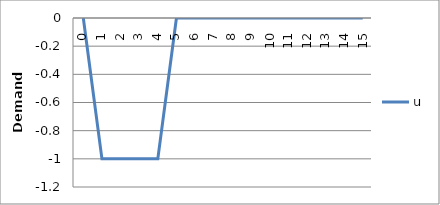
| Category | u |
|---|---|
| 0.0 | 0 |
| 1.0 | -1 |
| 2.0 | -1 |
| 3.0 | -1 |
| 4.0 | -1 |
| 5.0 | 0 |
| 6.0 | 0 |
| 7.0 | 0 |
| 8.0 | 0 |
| 9.0 | 0 |
| 10.0 | 0 |
| 11.0 | 0 |
| 12.0 | 0 |
| 13.0 | 0 |
| 14.0 | 0 |
| 15.0 | 0 |